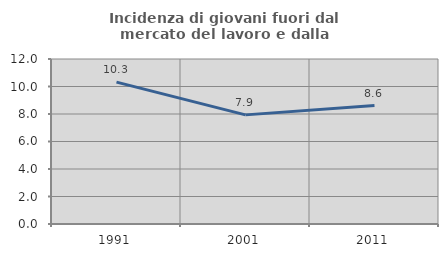
| Category | Incidenza di giovani fuori dal mercato del lavoro e dalla formazione  |
|---|---|
| 1991.0 | 10.32 |
| 2001.0 | 7.937 |
| 2011.0 | 8.612 |